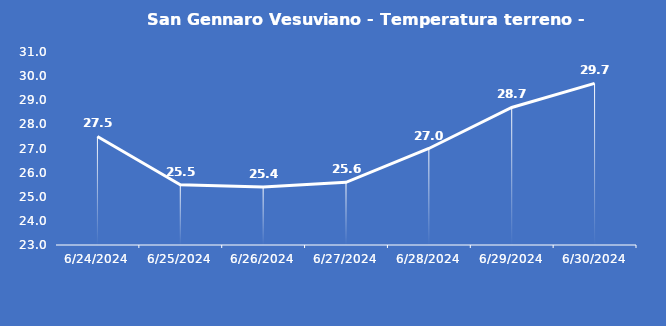
| Category | San Gennaro Vesuviano - Temperatura terreno - Grezzo (°C) |
|---|---|
| 6/24/24 | 27.5 |
| 6/25/24 | 25.5 |
| 6/26/24 | 25.4 |
| 6/27/24 | 25.6 |
| 6/28/24 | 27 |
| 6/29/24 | 28.7 |
| 6/30/24 | 29.7 |